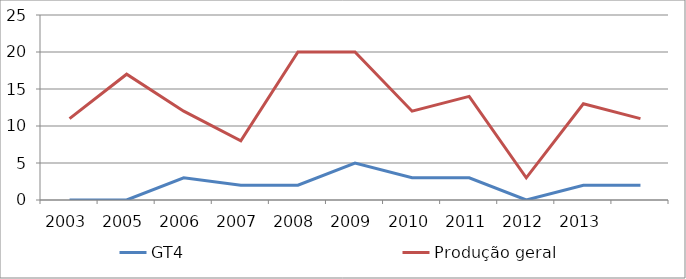
| Category | GT4 | Produção geral |
|---|---|---|
| 2003.0 | 0 | 11 |
| 2005.0 | 0 | 17 |
| 2006.0 | 3 | 12 |
| 2007.0 | 2 | 8 |
| 2008.0 | 2 | 20 |
| 2009.0 | 5 | 20 |
| 2010.0 | 3 | 12 |
| 2011.0 | 3 | 14 |
| 2012.0 | 0 | 3 |
| 2013.0 | 2 | 13 |